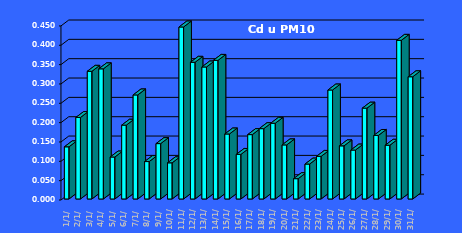
| Category | Cd u PM10 [ng/m3] |
|---|---|
| 2023-01-01 | 0.135 |
| 2023-01-02 | 0.211 |
| 2023-01-03 | 0.33 |
| 2023-01-04 | 0.336 |
| 2023-01-05 | 0.108 |
| 2023-01-06 | 0.191 |
| 2023-01-07 | 0.269 |
| 2023-01-08 | 0.097 |
| 2023-01-09 | 0.143 |
| 2023-01-10 | 0.093 |
| 2023-01-11 | 0.445 |
| 2023-01-12 | 0.353 |
| 2023-01-13 | 0.341 |
| 2023-01-14 | 0.358 |
| 2023-01-15 | 0.168 |
| 2023-01-16 | 0.115 |
| 2023-01-17 | 0.166 |
| 2023-01-18 | 0.182 |
| 2023-01-19 | 0.196 |
| 2023-01-20 | 0.14 |
| 2023-01-21 | 0.053 |
| 2023-01-22 | 0.09 |
| 2023-01-23 | 0.11 |
| 2023-01-24 | 0.282 |
| 2023-01-25 | 0.137 |
| 2023-01-26 | 0.126 |
| 2023-01-27 | 0.235 |
| 2023-01-28 | 0.164 |
| 2023-01-29 | 0.139 |
| 2023-01-30 | 0.41 |
| 2023-01-31 | 0.316 |